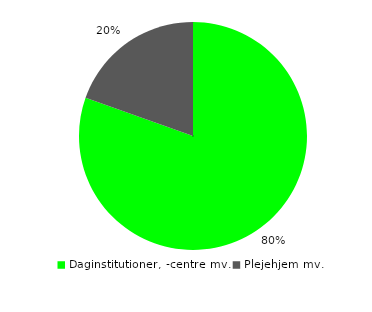
| Category | Social sikring |
|---|---|
| Daginstitutioner, -centre mv. | 0.804 |
| Plejehjem mv. | 0.196 |